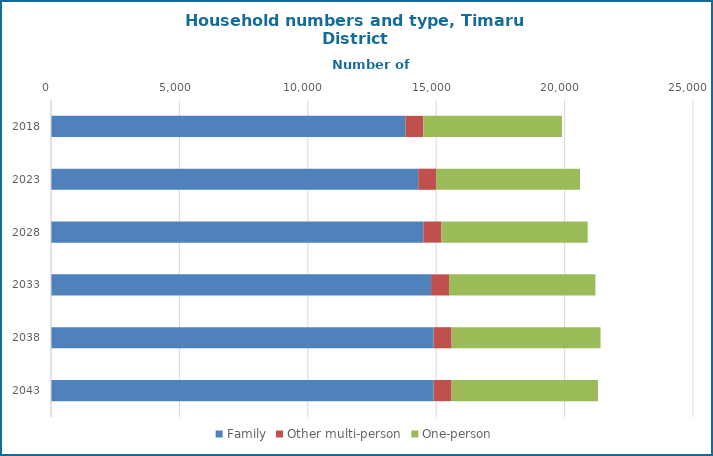
| Category | Family | Other multi-person | One-person |
|---|---|---|---|
| 2018.0 | 13800 | 700 | 5400 |
| 2023.0 | 14300 | 700 | 5600 |
| 2028.0 | 14500 | 700 | 5700 |
| 2033.0 | 14800 | 700 | 5700 |
| 2038.0 | 14900 | 700 | 5800 |
| 2043.0 | 14900 | 700 | 5700 |